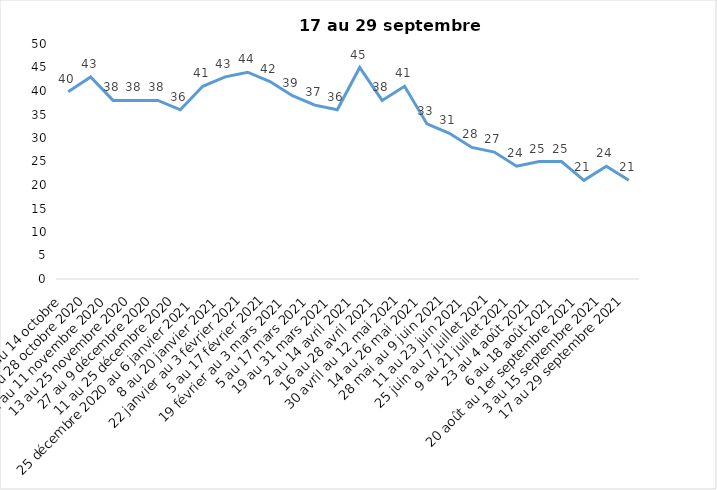
| Category | Toujours aux trois mesures |
|---|---|
| 2 au 14 octobre  | 39.85 |
| 16 au 28 octobre 2020 | 43 |
| 30 octobre au 11 novembre 2020 | 38 |
| 13 au 25 novembre 2020 | 38 |
| 27 au 9 décembre 2020 | 38 |
| 11 au 25 décembre 2020 | 36 |
| 25 décembre 2020 au 6 janvier 2021 | 41 |
| 8 au 20 janvier 2021 | 43 |
| 22 janvier au 3 février 2021 | 44 |
| 5 au 17 février 2021 | 42 |
| 19 février au 3 mars 2021 | 39 |
| 5 au 17 mars 2021 | 37 |
| 19 au 31 mars 2021 | 36 |
| 2 au 14 avril 2021 | 45 |
| 16 au 28 avril 2021 | 38 |
| 30 avril au 12 mai 2021 | 41 |
| 14 au 26 mai 2021 | 33 |
| 28 mai au 9 juin 2021 | 31 |
| 11 au 23 juin 2021 | 28 |
| 25 juin au 7 juillet 2021 | 27 |
| 9 au 21 juillet 2021 | 24 |
| 23 au 4 août 2021 | 25 |
| 6 au 18 août 2021 | 25 |
| 20 août au 1er septembre 2021 | 21 |
| 3 au 15 septembre 2021 | 24 |
| 17 au 29 septembre 2021 | 21 |